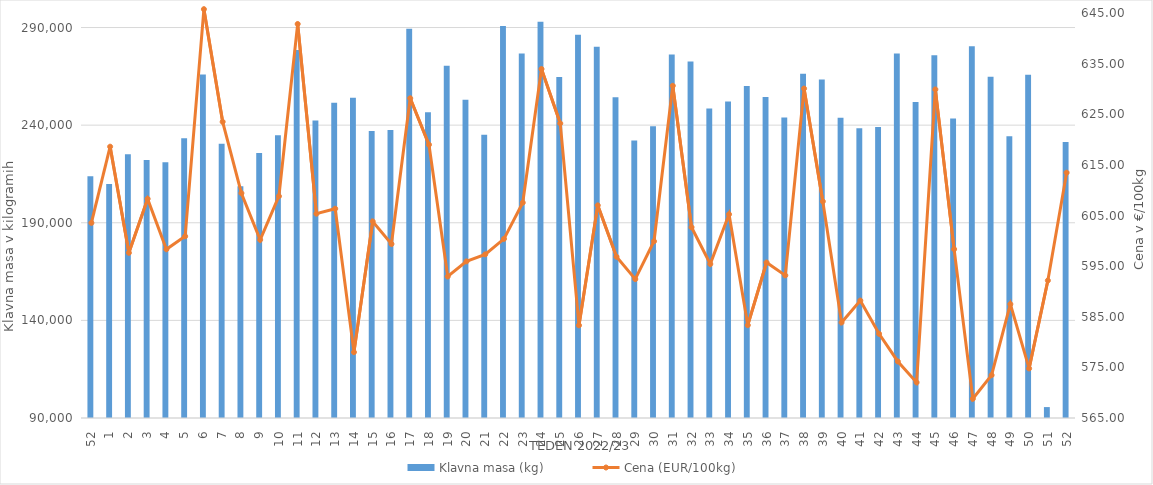
| Category | Klavna masa (kg) |
|---|---|
| 52.0 | 213841 |
| 1.0 | 209877 |
| 2.0 | 225045 |
| 3.0 | 222198 |
| 4.0 | 221002 |
| 5.0 | 233306 |
| 6.0 | 265944 |
| 7.0 | 230531 |
| 8.0 | 208699 |
| 9.0 | 225712 |
| 10.0 | 234762 |
| 11.0 | 278467 |
| 12.0 | 242369 |
| 13.0 | 251507 |
| 14.0 | 254072 |
| 15.0 | 236964 |
| 16.0 | 237552 |
| 17.0 | 289400 |
| 18.0 | 246616 |
| 19.0 | 270374 |
| 20.0 | 252984 |
| 21.0 | 235060 |
| 22.0 | 290816 |
| 23.0 | 276702 |
| 24.0 | 292976 |
| 25.0 | 264669 |
| 26.0 | 286237 |
| 27.0 | 280112 |
| 28.0 | 254336 |
| 29.0 | 232178 |
| 30.0 | 239437 |
| 31.0 | 276163 |
| 32.0 | 272647 |
| 33.0 | 248536 |
| 34.0 | 252050 |
| 35.0 | 260110 |
| 36.0 | 254389 |
| 37.0 | 243933 |
| 38.0 | 266321 |
| 39.0 | 263346 |
| 40.0 | 243765 |
| 41.0 | 238404 |
| 42.0 | 239007 |
| 43.0 | 276684 |
| 44.0 | 251832 |
| 45.0 | 275816 |
| 46.0 | 243425 |
| 47.0 | 280350 |
| 48.0 | 264849 |
| 49.0 | 234308 |
| 50.0 | 265786 |
| 51.0 | 95590 |
| 52.0 | 231370 |